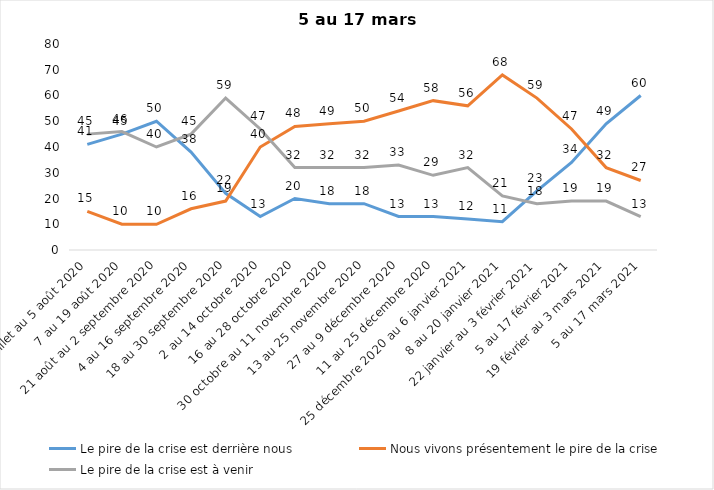
| Category | Le pire de la crise est derrière nous | Nous vivons présentement le pire de la crise | Le pire de la crise est à venir |
|---|---|---|---|
| 24 juillet au 5 août 2020 | 41 | 15 | 45 |
| 7 au 19 août 2020 | 45 | 10 | 46 |
| 21 août au 2 septembre 2020 | 50 | 10 | 40 |
| 4 au 16 septembre 2020 | 38 | 16 | 45 |
| 18 au 30 septembre 2020 | 22 | 19 | 59 |
| 2 au 14 octobre 2020 | 13 | 40 | 47 |
| 16 au 28 octobre 2020 | 20 | 48 | 32 |
| 30 octobre au 11 novembre 2020 | 18 | 49 | 32 |
| 13 au 25 novembre 2020 | 18 | 50 | 32 |
| 27 au 9 décembre 2020 | 13 | 54 | 33 |
| 11 au 25 décembre 2020 | 13 | 58 | 29 |
| 25 décembre 2020 au 6 janvier 2021 | 12 | 56 | 32 |
| 8 au 20 janvier 2021 | 11 | 68 | 21 |
| 22 janvier au 3 février 2021 | 23 | 59 | 18 |
| 5 au 17 février 2021 | 34 | 47 | 19 |
| 19 février au 3 mars 2021 | 49 | 32 | 19 |
| 5 au 17 mars 2021 | 60 | 27 | 13 |